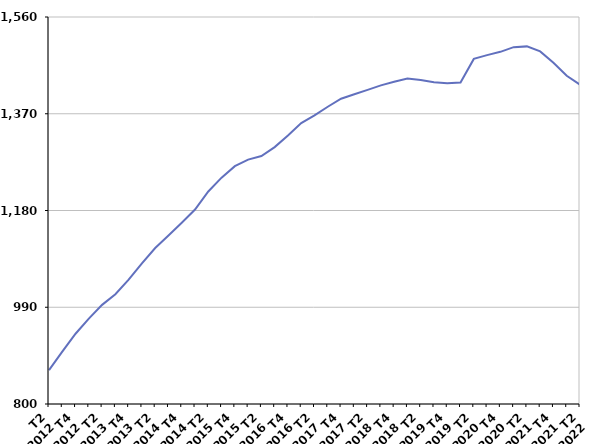
| Category | 50 ans ou plus |
|---|---|
| T2
2012 | 866.6 |
| T3
2012 | 902.8 |
| T4
2012 | 938 |
| T1
2013 | 967.6 |
| T2
2013 | 994.7 |
| T3
2013 | 1015.6 |
| T4
2013 | 1044.2 |
| T1
2014 | 1076.2 |
| T2
2014 | 1106.4 |
| T3
2014 | 1130.8 |
| T4
2014 | 1155.9 |
| T1
2015 | 1181.8 |
| T2
2015 | 1217.4 |
| T3
2015 | 1244.5 |
| T4
2015 | 1267 |
| T1
2016 | 1279.9 |
| T2
2016 | 1287.1 |
| T3
2016 | 1304.5 |
| T4
2016 | 1327.1 |
| T1
2017 | 1351.7 |
| T2
2017 | 1366.9 |
| T3
2017 | 1383.8 |
| T4
2017 | 1399.6 |
| T1
2018 | 1408.3 |
| T2
2018 | 1416.9 |
| T3
2018 | 1425.8 |
| T4
2018 | 1433 |
| T1
2019 | 1439.4 |
| T2
2019 | 1436.4 |
| T3
2019 | 1432 |
| T4
2019 | 1429.9 |
| T1
2020 | 1431.4 |
| T2
2020 | 1477.7 |
| T3
2020 | 1485.1 |
| T4
2020 | 1491.6 |
| T1
2021 | 1500.8 |
| T2
2021 | 1502.3 |
| T3
2021 | 1492.4 |
| T4
2021 | 1470.1 |
| T1
2022 | 1444.6 |
| T2
2022 | 1427.1 |